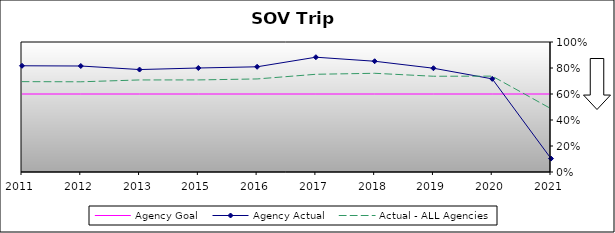
| Category | Agency Goal | Agency Actual | Actual - ALL Agencies |
|---|---|---|---|
| 2011.0 | 0.6 | 0.817 | 0.695 |
| 2012.0 | 0.6 | 0.815 | 0.694 |
| 2013.0 | 0.6 | 0.788 | 0.708 |
| 2015.0 | 0.6 | 0.8 | 0.708 |
| 2016.0 | 0.6 | 0.809 | 0.716 |
| 2017.0 | 0.6 | 0.883 | 0.752 |
| 2018.0 | 0.6 | 0.852 | 0.759 |
| 2019.0 | 0.6 | 0.798 | 0.736 |
| 2020.0 | 0.6 | 0.716 | 0.737 |
| 2021.0 | 0.6 | 0.103 | 0.487 |